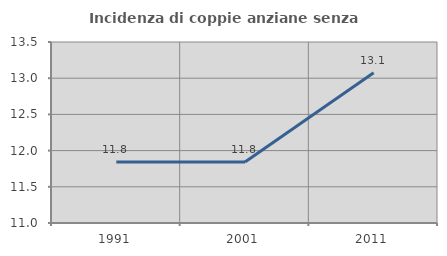
| Category | Incidenza di coppie anziane senza figli  |
|---|---|
| 1991.0 | 11.842 |
| 2001.0 | 11.842 |
| 2011.0 | 13.074 |